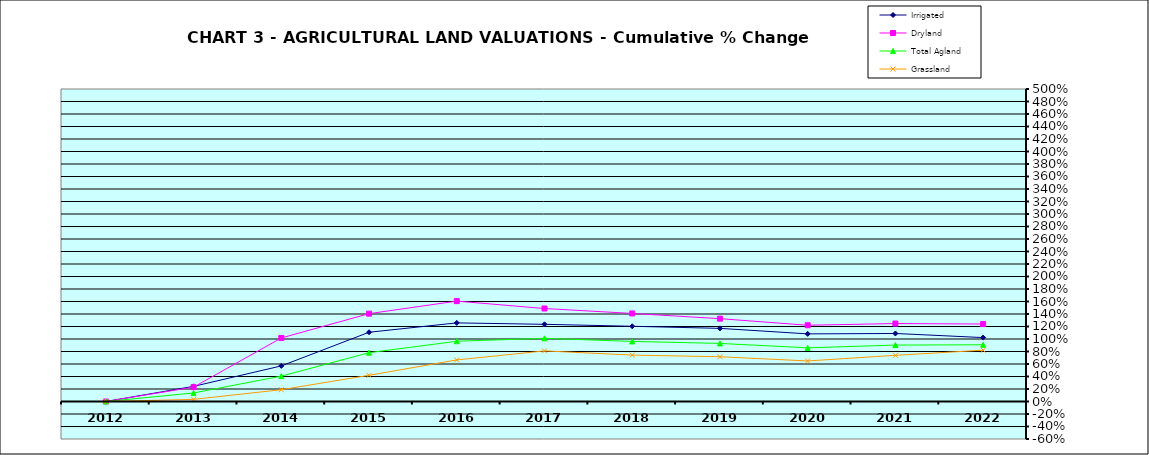
| Category | Irrigated | Dryland | Total Agland | Grassland |
|---|---|---|---|---|
| 2012.0 | 0 | 0 | 0 | 0 |
| 2013.0 | 0.242 | 0.23 | 0.137 | 0.034 |
| 2014.0 | 0.569 | 1.016 | 0.406 | 0.189 |
| 2015.0 | 1.108 | 1.405 | 0.781 | 0.419 |
| 2016.0 | 1.258 | 1.606 | 0.964 | 0.665 |
| 2017.0 | 1.235 | 1.488 | 1.011 | 0.81 |
| 2018.0 | 1.204 | 1.409 | 0.962 | 0.742 |
| 2019.0 | 1.17 | 1.325 | 0.929 | 0.716 |
| 2020.0 | 1.082 | 1.22 | 0.859 | 0.649 |
| 2021.0 | 1.088 | 1.247 | 0.903 | 0.739 |
| 2022.0 | 1.023 | 1.239 | 0.908 | 0.821 |